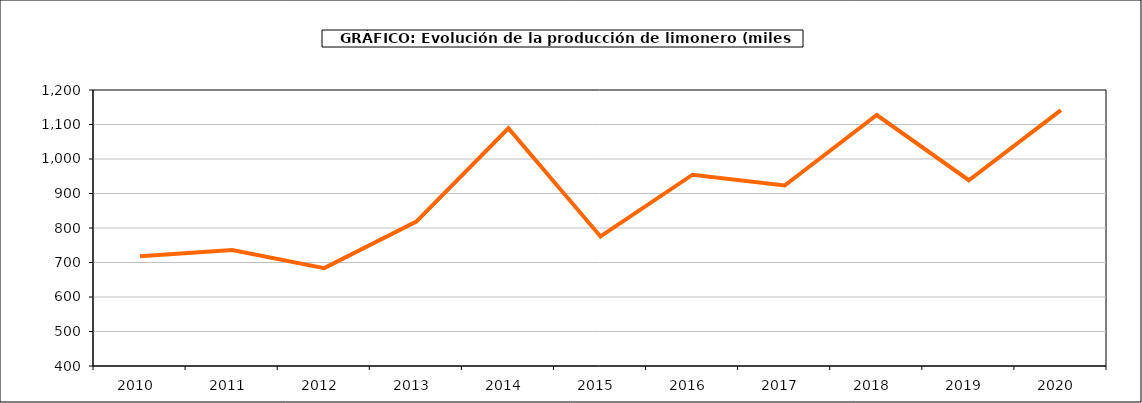
| Category | producción |
|---|---|
| 2010.0 | 717.906 |
| 2011.0 | 736.198 |
| 2012.0 | 683.604 |
| 2013.0 | 818.489 |
| 2014.0 | 1088.964 |
| 2015.0 | 775.546 |
| 2016.0 | 954.479 |
| 2017.0 | 923.192 |
| 2018.0 | 1127.509 |
| 2019.0 | 938.42 |
| 2020.0 | 1141.574 |